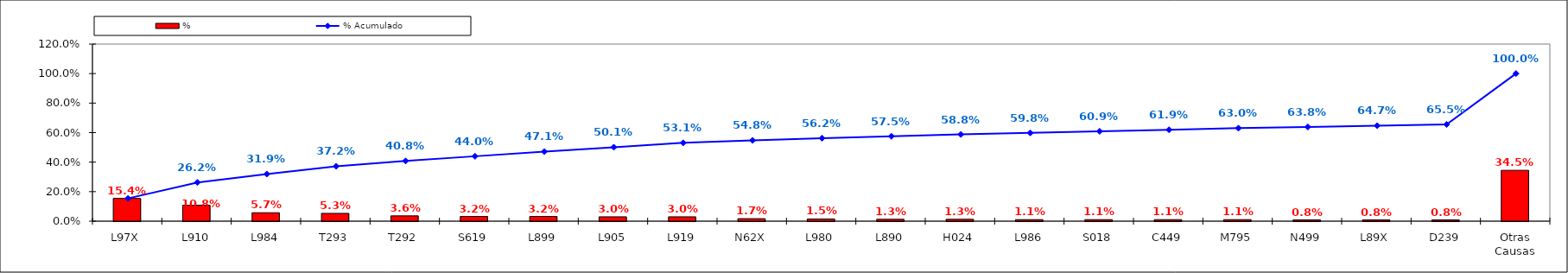
| Category | % |
|---|---|
| L97X | 0.154 |
| L910 | 0.108 |
| L984 | 0.057 |
| T293 | 0.053 |
| T292 | 0.036 |
| S619 | 0.032 |
| L899 | 0.032 |
| L905 | 0.03 |
| L919 | 0.03 |
| N62X | 0.017 |
| L980 | 0.015 |
| L890 | 0.013 |
| H024 | 0.013 |
| L986 | 0.011 |
| S018 | 0.011 |
| C449 | 0.011 |
| M795 | 0.011 |
| N499 | 0.008 |
| L89X | 0.008 |
| D239 | 0.008 |
| Otras Causas | 0.345 |